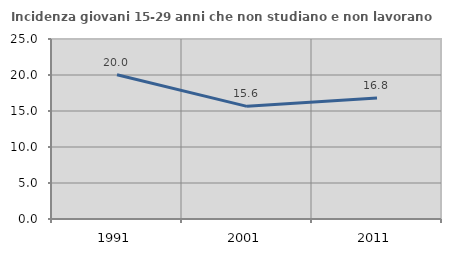
| Category | Incidenza giovani 15-29 anni che non studiano e non lavorano  |
|---|---|
| 1991.0 | 20.025 |
| 2001.0 | 15.645 |
| 2011.0 | 16.801 |